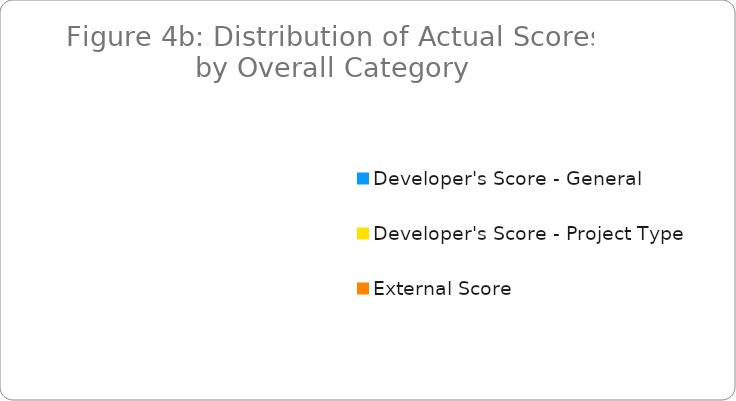
| Category | Series 0 |
|---|---|
| Developer's Score - General | 0 |
| Developer's Score - Project Type | 0 |
| External Score | 0 |